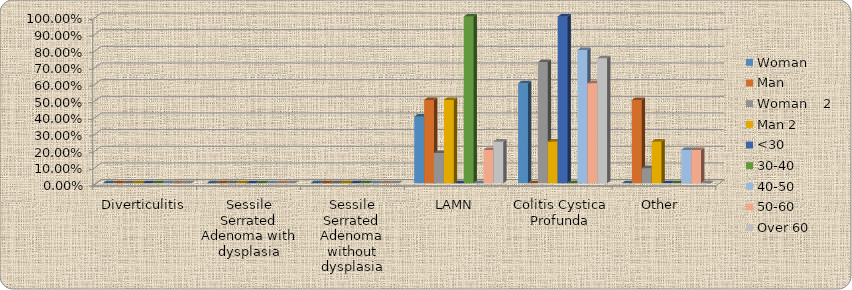
| Category | Woman     | Man  | Woman    2 | Man 2 | <30 | 30-40 | 40-50 | 50-60 | Over 60 |
|---|---|---|---|---|---|---|---|---|---|
| Diverticulitis | 0 | 0 | 0 | 0 | 0 | 0 | 0 | 0 | 0 |
| Sessile Serrated Adenoma with dysplasia | 0 | 0 | 0 | 0 | 0 | 0 | 0 | 0 | 0 |
| Sessile Serrated Adenoma without dysplasia | 0 | 0 | 0 | 0 | 0 | 0 | 0 | 0 | 0 |
| LAMN | 0.4 | 0.5 | 0.182 | 0.5 | 0 | 1 | 0 | 0.2 | 0.25 |
| Colitis Cystica Profunda | 0.6 | 0 | 0.727 | 0.25 | 1 | 0 | 0.8 | 0.6 | 0.75 |
| Other  | 0 | 0.5 | 0.091 | 0.25 | 0 | 0 | 0.2 | 0.2 | 0 |